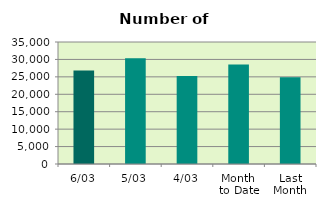
| Category | Series 0 |
|---|---|
| 6/03 | 26840 |
| 5/03 | 30348 |
| 4/03 | 25226 |
| Month 
to Date | 28544 |
| Last
Month | 24872.2 |